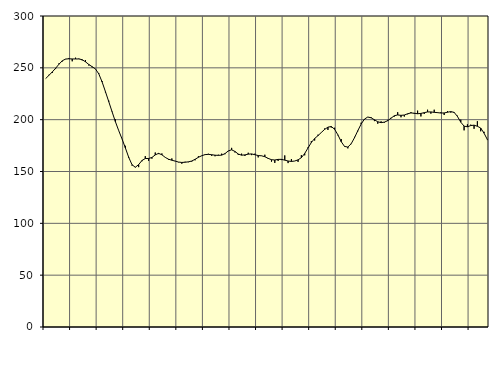
| Category | Piggar | Series 1 |
|---|---|---|
| nan | 239.7 | 239.65 |
| 87.0 | 243.3 | 242.8 |
| 87.0 | 245.1 | 246.07 |
| 87.0 | 248.8 | 249.6 |
| nan | 254.3 | 253.47 |
| 88.0 | 256.1 | 256.8 |
| 88.0 | 258.3 | 258.48 |
| 88.0 | 259.5 | 258.73 |
| nan | 256.3 | 258.58 |
| 89.0 | 259.8 | 258.54 |
| 89.0 | 258.9 | 258.57 |
| 89.0 | 257.2 | 257.83 |
| nan | 257.5 | 255.8 |
| 90.0 | 252.2 | 253.21 |
| 90.0 | 250.4 | 251.1 |
| 90.0 | 249 | 248.9 |
| nan | 244.9 | 244.19 |
| 91.0 | 237.2 | 236.37 |
| 91.0 | 226.3 | 227.07 |
| 91.0 | 218.3 | 217.39 |
| nan | 208 | 207.63 |
| 92.0 | 200.3 | 198.05 |
| 92.0 | 189.3 | 189.4 |
| 92.0 | 181.3 | 181.42 |
| nan | 174.8 | 172.77 |
| 93.0 | 163.1 | 163.76 |
| 93.0 | 155.7 | 156.57 |
| 93.0 | 154.4 | 154.07 |
| nan | 154.2 | 156.63 |
| 94.0 | 159.9 | 160.62 |
| 94.0 | 164.8 | 162.52 |
| 94.0 | 160.3 | 162.56 |
| nan | 162.4 | 163.52 |
| 95.0 | 168.3 | 166.03 |
| 95.0 | 166.8 | 167.49 |
| 95.0 | 167.4 | 166.12 |
| nan | 163.7 | 163.63 |
| 96.0 | 161.3 | 161.84 |
| 96.0 | 162.6 | 160.87 |
| 96.0 | 160.2 | 160.03 |
| nan | 158.9 | 159.11 |
| 97.0 | 157.5 | 158.73 |
| 97.0 | 159.4 | 158.95 |
| 97.0 | 159 | 159.32 |
| nan | 159.6 | 160.12 |
| 98.0 | 160.8 | 161.78 |
| 98.0 | 164.7 | 163.71 |
| 98.0 | 165.1 | 165.22 |
| nan | 166.5 | 166.29 |
| 99.0 | 167.1 | 166.52 |
| 99.0 | 165.1 | 166.19 |
| 99.0 | 164.7 | 165.73 |
| nan | 166.2 | 165.56 |
| 0.0 | 167.2 | 165.79 |
| 0.0 | 166.7 | 167.25 |
| 0.0 | 169.6 | 169.86 |
| nan | 172.8 | 170.91 |
| 1.0 | 168.4 | 169.36 |
| 1.0 | 166 | 166.88 |
| 1.0 | 167.2 | 165.74 |
| nan | 165 | 166.01 |
| 2.0 | 168.1 | 166.73 |
| 2.0 | 165.8 | 166.95 |
| 2.0 | 167.2 | 166.2 |
| nan | 163.6 | 165.4 |
| 3.0 | 165 | 165.14 |
| 3.0 | 166.2 | 164.27 |
| 3.0 | 162.2 | 162.65 |
| nan | 159.5 | 161.38 |
| 4.0 | 158.3 | 161.1 |
| 4.0 | 160.2 | 161.69 |
| 4.0 | 161 | 161.72 |
| nan | 165.5 | 160.95 |
| 5.0 | 158.1 | 160.13 |
| 5.0 | 162 | 159.7 |
| 5.0 | 160.1 | 160.11 |
| nan | 159.3 | 161.24 |
| 6.0 | 165.8 | 163.33 |
| 6.0 | 165.6 | 167.36 |
| 6.0 | 173.3 | 172.71 |
| nan | 179.3 | 177.95 |
| 7.0 | 179.9 | 181.82 |
| 7.0 | 185.5 | 184.58 |
| 7.0 | 187.5 | 187.61 |
| nan | 191.5 | 190.58 |
| 8.0 | 190.1 | 192.79 |
| 8.0 | 192.4 | 193.4 |
| 8.0 | 192.2 | 190.78 |
| nan | 184.9 | 185.36 |
| 9.0 | 181.3 | 178.74 |
| 9.0 | 173.9 | 174.18 |
| 9.0 | 172.3 | 173.58 |
| nan | 176.4 | 176.76 |
| 10.0 | 183.4 | 182.59 |
| 10.0 | 188.8 | 189.38 |
| 10.0 | 197.1 | 195.77 |
| nan | 200.1 | 200.58 |
| 11.0 | 202.6 | 202.54 |
| 11.0 | 202.4 | 201.81 |
| 11.0 | 198.6 | 199.88 |
| nan | 196.1 | 197.98 |
| 12.0 | 198.4 | 197.13 |
| 12.0 | 197.1 | 197.63 |
| 12.0 | 199.8 | 199.04 |
| nan | 201.8 | 201.42 |
| 13.0 | 203 | 203.8 |
| 13.0 | 207.2 | 204.55 |
| 13.0 | 202.3 | 204.16 |
| nan | 203 | 204.48 |
| 14.0 | 205.2 | 205.68 |
| 14.0 | 207.3 | 206.5 |
| 14.0 | 205.6 | 206.19 |
| nan | 208.7 | 205.7 |
| 15.0 | 203.1 | 206.03 |
| 15.0 | 205.5 | 206.77 |
| 15.0 | 209.6 | 207.45 |
| nan | 205.8 | 207.46 |
| 16.0 | 209.6 | 207.05 |
| 16.0 | 207.1 | 206.79 |
| 16.0 | 207.1 | 206.4 |
| nan | 204.5 | 206.48 |
| 17.0 | 208.3 | 207.18 |
| 17.0 | 206.8 | 207.79 |
| 17.0 | 206.5 | 207.02 |
| nan | 203.8 | 203.13 |
| 18.0 | 200 | 197.57 |
| 18.0 | 189.7 | 193.76 |
| 18.0 | 195.5 | 193.13 |
| nan | 195.2 | 194.31 |
| 19.0 | 191.2 | 194.7 |
| 19.0 | 198.5 | 193.63 |
| 19.0 | 188.8 | 191.94 |
| nan | 188.3 | 186.99 |
| 20.0 | 180.3 | 180.88 |